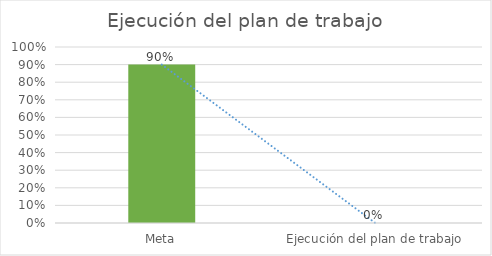
| Category | Series 0 |
|---|---|
| Meta | 0.9 |
| Ejecución del plan de trabajo | 0 |